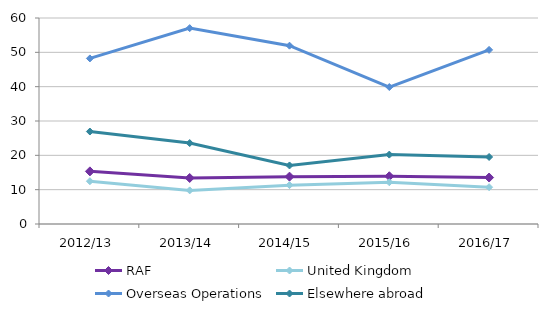
| Category | RAF | United Kingdom | Overseas Operations | Elsewhere abroad |
|---|---|---|---|---|
| 2012/13 | 15.329 | 12.461 | 48.229 | 26.935 |
| 2013/14 | 13.401 | 9.792 | 57.049 | 23.577 |
| 2014/15 | 13.796 | 11.318 | 51.937 | 17.052 |
| 2015/16 | 13.903 | 12.158 | 39.89 | 20.213 |
| 2016/17 | 13.531 | 10.718 | 50.714 | 19.523 |